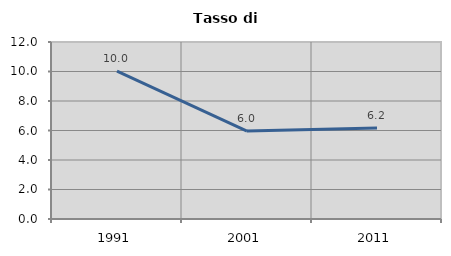
| Category | Tasso di disoccupazione   |
|---|---|
| 1991.0 | 10.028 |
| 2001.0 | 5.964 |
| 2011.0 | 6.163 |